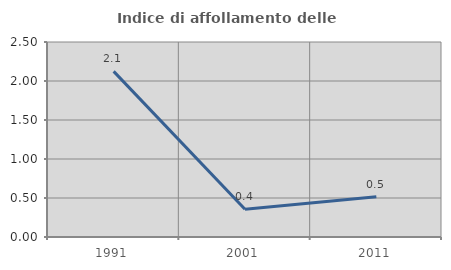
| Category | Indice di affollamento delle abitazioni  |
|---|---|
| 1991.0 | 2.124 |
| 2001.0 | 0.355 |
| 2011.0 | 0.517 |